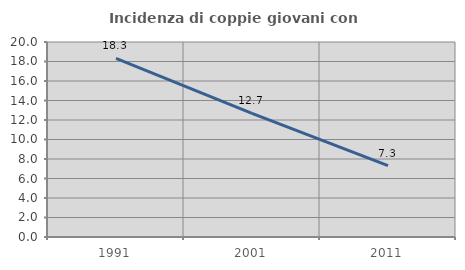
| Category | Incidenza di coppie giovani con figli |
|---|---|
| 1991.0 | 18.329 |
| 2001.0 | 12.675 |
| 2011.0 | 7.321 |